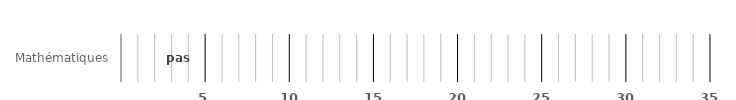
| Category | pas recommandé |
|---|---|
| Mathématiques | 0 |